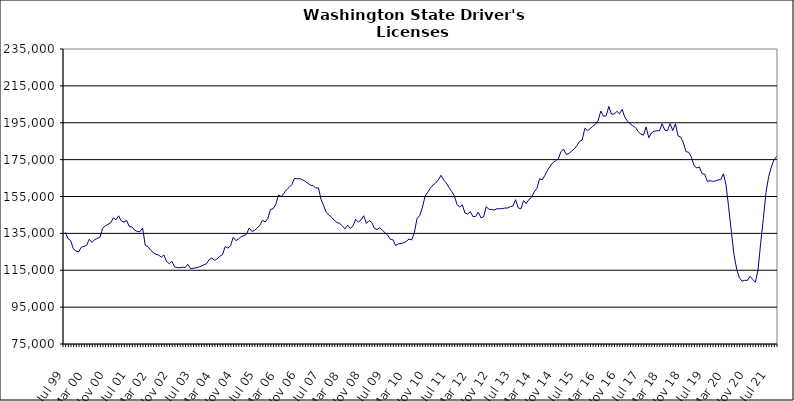
| Category | Series 0 |
|---|---|
| Jul 99 | 135560 |
| Aug 99 | 132182 |
| Sep 99 | 131104 |
| Oct 99 | 126694 |
| Nov 99 | 125425 |
| Dec 99 | 124927 |
| Jan 00 | 127499 |
| Feb 00 | 127927 |
| Mar 00 | 128547 |
| Apr 00 | 131834 |
| May 00 | 130120 |
| Jun 00 | 131595 |
| Jul 00 | 132236 |
| Aug 00 | 132819 |
| Sep 00 | 137711 |
| Oct 00 | 139063 |
| Nov 00 | 139952 |
| Dec 00 | 140732 |
| Jan 01 | 143338 |
| Feb 01 | 142359 |
| Mar 01 | 144523 |
| Apr 01 | 141758 |
| May 01 | 141135 |
| Jun 01 | 142064 |
| Jul 01 | 138646 |
| Aug 01 | 138530 |
| Sep 01 | 136784 |
| Oct 01 | 135996 |
| Nov 01 | 135917 |
| Dec 01 | 137940 |
| Jan 02 | 128531 |
| Feb 02 | 127848 |
| Mar 02 | 125876 |
| Apr 02 | 124595 |
| May 02 | 123660 |
| Jun 02 | 123282 |
| Jul 02 | 122089 |
| Aug 02 | 123279 |
| Sep 02 | 119727 |
| Oct 02 | 118588 |
| Nov 02 | 119854 |
| Dec 02 | 116851 |
| Jan 03 | 116407 |
| Feb 03 | 116382 |
| Mar 03 | 116648 |
| Apr 03 | 116471 |
| May 03 | 118231 |
| Jun 03 | 115831 |
| Jul 03 | 116082 |
| Aug 03 | 116341 |
| Sep 03 | 116653 |
| Oct 03 | 117212 |
| Nov 03 | 117962 |
| Dec 03 | 118542 |
| Jan 04 | 120817 |
| Feb 04 | 121617 |
| Mar 04 | 120369 |
| Apr 04 | 121200 |
| May 04 | 122609 |
| Jun 04 | 123484 |
| Jul 04 | 127844 |
| Aug 04 | 127025 |
| Sep 04 | 128273 |
| Oct 04 | 132853 |
| Nov 04 | 131106 |
| Dec 04 | 131935 |
| Jan 05 | 133205 |
| Feb 05 | 133736 |
| Mar 05 | 134528 |
| Apr 05 | 137889 |
| May 05 | 136130 |
| Jun 05 | 136523 |
| Jul 05 | 137997 |
| Aug 05 | 139294 |
| Sep 05 | 142140 |
| Oct 05 | 141192 |
| Nov 05 | 142937 |
| Dec 05 | 148013 |
| Jan 06 | 148341 |
| Feb 06 | 150744 |
| Mar 06 | 155794 |
| Apr 06 | 154984 |
| May 06 | 156651 |
| Jun 06 | 158638 |
| Jul 06 | 159911 |
| Aug 06 | 161445 |
| Sep 06 | 164852 |
| Oct 06 | 164570 |
| Nov 06 | 164679 |
| Dec 06 | 164127 |
| Jan 07 | 163271 |
| Feb 07 | 162273 |
| Mar 07 | 161140 |
| Apr 07 | 160860 |
| May 07 | 159633 |
| Jun 07 | 159724 |
| Jul 07 | 153303 |
| Aug 07 | 149939 |
| Sep 07 | 146172 |
| Oct 07 | 144876 |
| Nov 07 | 143613 |
| Dec 07 | 142022 |
| Jan 08 | 140909 |
| Feb 08 | 140368 |
| Mar 08 | 138998 |
| Apr 08 | 137471 |
| May 08 | 139453 |
| Jun 08 | 137680 |
| Jul 08 | 139120 |
| Aug 08 | 142612 |
| Sep-08 | 141071 |
| Oct 08 | 142313 |
| Nov 08 | 144556 |
| Dec 08 | 140394 |
| Jan 09 | 141903 |
| Feb 09 | 141036 |
| Mar 09 | 137751 |
| Apr 09 | 137060 |
| May 09 | 138101 |
| Jun 09 | 136739 |
| Jul 09 | 135317 |
| Aug 09 | 134020 |
| Sep 09 | 131756 |
| Oct 09 | 131488 |
| Nov 09 | 128370 |
| Dec 09 | 129323 |
| Jan 10 | 129531 |
| Feb 10 | 129848 |
| Mar 10 | 130654 |
| Apr 10 | 131929 |
| May 10 | 131429 |
| Jun 10 | 135357 |
| Jul 10 | 143032 |
| Aug 10 | 144686 |
| Sep 10 | 148856 |
| Oct 10 | 155042 |
| Nov 10 | 157328 |
| Dec 10 | 159501 |
| Jan 11 | 161221 |
| Feb 11 | 162312 |
| Mar 11 | 163996 |
| Apr 11 | 166495 |
| May 11 | 164040 |
| Jun 11 | 162324 |
| Jul 11 | 159862 |
| Aug 11 | 157738 |
| Sep 11 | 155430 |
| Oct 11 | 150762 |
| Nov 11 | 149255 |
| Dec 11 | 150533 |
| Jan 12 | 146068 |
| Feb 12 | 145446 |
| Mar 12 | 146788 |
| Apr 12 | 144110 |
| May 12 | 144162 |
| Jun 12 | 146482 |
| Jul 12 | 143445 |
| Aug 12 | 143950 |
| Sep 12 | 149520 |
| Oct 12 | 148033 |
| Nov 12 | 147926 |
| Dec 12 | 147674 |
| Jan 13 | 148360 |
| Feb-13 | 148388 |
| Mar-13 | 148414 |
| Apr 13 | 148749 |
| May 13 | 148735 |
| Jun-13 | 149521 |
| Jul 13 | 149837 |
| Aug 13 | 153252 |
| Sep 13 | 148803 |
| Oct 13 | 148315 |
| Nov 13 | 152804 |
| Dec 13 | 151209 |
| Jan 14 | 153357 |
| Feb-14 | 154608 |
| Mar 14 | 157479 |
| Apr 14 | 159441 |
| May 14 | 164591 |
| Jun 14 | 163995 |
| Jul-14 | 166411 |
| Aug-14 | 169272 |
| Sep 14 | 171565 |
| Oct 14 | 173335 |
| Nov 14 | 174406 |
| Dec 14 | 175302 |
| Jan 15 | 179204 |
| Feb 15 | 180737 |
| Mar 15 | 177810 |
| Apr-15 | 178331 |
| May 15 | 179601 |
| Jun-15 | 180729 |
| Jul 15 | 182540 |
| Aug 15 | 184924 |
| Sep 15 | 185620 |
| Oct 15 | 192002 |
| Nov 15 | 190681 |
| Dec 15 | 191795 |
| Jan 16 | 193132 |
| Feb 16 | 194206 |
| Mar 16 | 196319 |
| Apr 16 | 201373 |
| May 16 | 198500 |
| Jun 16 | 198743 |
| Jul 16 | 203841 |
| Aug 16 | 199630 |
| Sep 16 | 199655 |
| Oct 16 | 201181 |
| Nov 16 | 199888 |
| Dec 16 | 202304 |
| Jan 17 | 197977 |
| Feb 17 | 195889 |
| Mar 17 | 194438 |
| Apr 17 | 193335 |
| May 17 | 192430 |
| Jun 17 | 190298 |
| Jul 17 | 188832 |
| Aug 17 | 188264 |
| Sep 17 | 192738 |
| Oct 17 | 186856 |
| Nov 17 | 189537 |
| Dec 17 | 190341 |
| Jan 18 | 190670 |
| Feb 18 | 190645 |
| Mar 18 | 194476 |
| Apr 18 | 190971 |
| May 18 | 190707 |
| Jun 18 | 194516 |
| Jul 18 | 190783 |
| Aug 18 | 194390 |
| Sep 18 | 187831 |
| Oct 18 | 187188 |
| Nov 18 | 184054 |
| Dec 18 | 179347 |
| Jan 19 | 178958 |
| Feb 19 | 176289 |
| Mar 19 | 171747 |
| Apr 19 | 170532 |
| May 19 | 170967 |
| Jun 19 | 167444 |
| Jul 19 | 167059 |
| Aug 19 | 163194 |
| Sep 19 | 163599 |
| Oct 19 | 163212 |
| Nov 19 | 163388 |
| Dec 19 | 164024 |
| Jan 20 | 164114 |
| Feb 20 | 167320 |
| Mar 20 | 161221 |
| Apr 20 | 148866 |
| May 20 | 135821 |
| Jun 20 | 123252 |
| Jul 20 | 115526 |
| Aug 20 | 110940 |
| Sep 20 | 109099 |
| Oct 20 | 109566 |
| Nov 20 | 109488 |
| Dec 20 | 111658 |
| Jan 21 | 110070 |
| Feb 21 | 108491 |
| Mar 21 | 115176 |
| Apr 21 | 129726 |
| May 21 | 143052 |
| Jun 21 | 157253 |
| Jul 21 | 165832 |
| Aug 21 | 170937 |
| Sep 21 | 175042 |
| Oct 21 | 176696 |